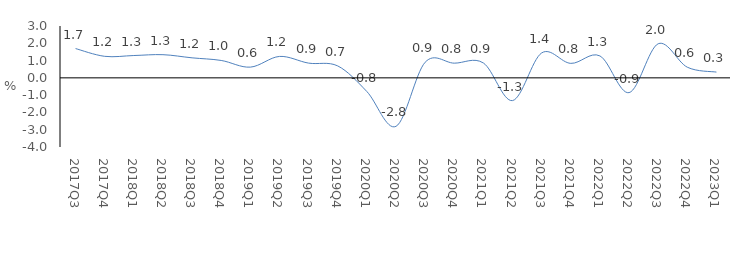
| Category | Series 0 |
|---|---|
| 2017Q3 | 1.694 |
| 2017Q4 | 1.245 |
| 2018Q1 | 1.292 |
| 2018Q2 | 1.341 |
| 2018Q3 | 1.158 |
| 2018Q4 | 1.007 |
| 2019Q1 | 0.62 |
| 2019Q2 | 1.239 |
| 2019Q3 | 0.853 |
| 2019Q4 | 0.69 |
| 2020Q1 | -0.792 |
| 2020Q2 | -2.805 |
| 2020Q3 | 0.901 |
| 2020Q4 | 0.85 |
| 2021Q1 | 0.86 |
| 2021Q2 | -1.315 |
| 2021Q3 | 1.442 |
| 2021Q4 | 0.838 |
| 2022Q1 | 1.27 |
| 2022Q2 | -0.855 |
| 2022Q3 | 1.973 |
| 2022Q4 | 0.616 |
| 2023Q1 | 0.334 |